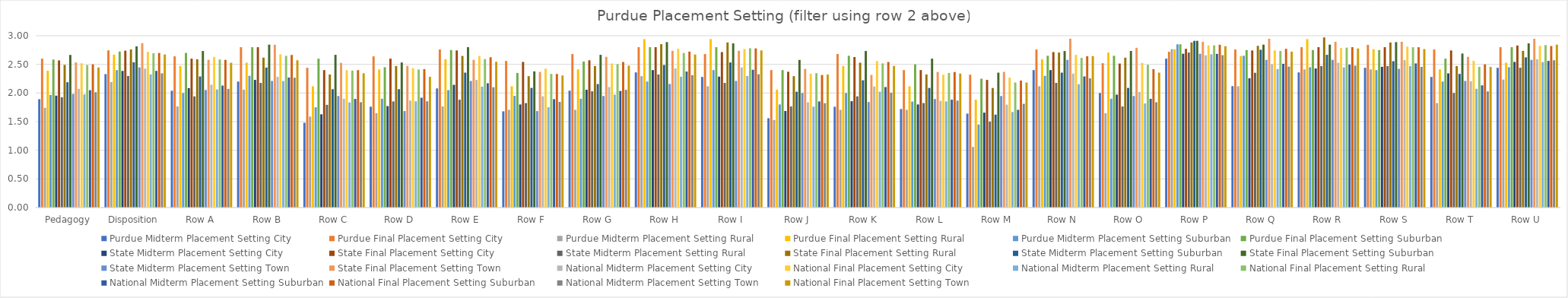
| Category | Purdue | State | National |
|---|---|---|---|
| Pedagogy | 2.585 | 2.534 | 2.445 |
| Disposition | 2.725 | 2.868 | 2.673 |
| Row A | 2.7 | 2.579 | 2.528 |
| Row B | 2.8 | 2.842 | 2.572 |
| Row C | 2.6 | 2.526 | 2.344 |
| Row D | 2.45 | 2.474 | 2.283 |
| Row E | 2.75 | 2.579 | 2.544 |
| Row F | 2.35 | 2.368 | 2.306 |
| Row G | 2.55 | 2.632 | 2.478 |
| Row H | 2.8 | 2.737 | 2.672 |
| Row I | 2.8 | 2.737 | 2.744 |
| Row J | 2.4 | 2.421 | 2.322 |
| Row K | 2.65 | 2.316 | 2.472 |
| Row L | 2.5 | 2.368 | 2.339 |
| Row M | 2.25 | 2.368 | 2.183 |
| Row N | 2.65 | 2.947 | 2.644 |
| Row O | 2.65 | 2.79 | 2.356 |
| Row P | 2.85 | 2.895 | 2.817 |
| Row Q | 2.75 | 2.947 | 2.722 |
| Row R | 2.75 | 2.895 | 2.778 |
| Row S | 2.75 | 2.895 | 2.767 |
| Row T | 2.6 | 2.632 | 2.456 |
| Row U | 2.8 | 2.947 | 2.844 |